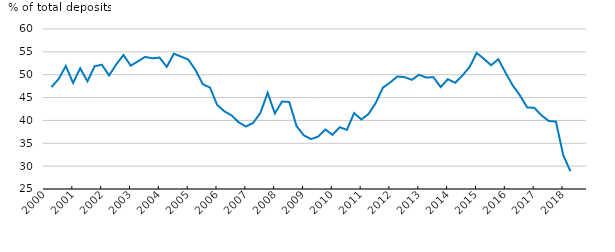
| Category | Series 2 |
|---|---|
| 2000-06-30 | 47.279 |
| 2000-09-30 | 49.07 |
| 2000-12-31 | 51.906 |
| 2001-03-31 | 48.212 |
| 2001-06-30 | 51.4 |
| 2001-09-30 | 48.548 |
| 2001-12-31 | 51.85 |
| 2002-03-31 | 52.194 |
| 2002-06-30 | 49.845 |
| 2002-09-30 | 52.27 |
| 2002-12-31 | 54.323 |
| 2003-03-31 | 51.984 |
| 2003-06-30 | 52.918 |
| 2003-09-30 | 53.906 |
| 2003-12-31 | 53.587 |
| 2004-03-31 | 53.753 |
| 2004-06-30 | 51.722 |
| 2004-09-30 | 54.598 |
| 2004-12-31 | 53.954 |
| 2005-03-31 | 53.308 |
| 2005-06-30 | 50.991 |
| 2005-09-30 | 47.93 |
| 2005-12-31 | 47.177 |
| 2006-03-31 | 43.386 |
| 2006-06-30 | 41.994 |
| 2006-09-30 | 41.096 |
| 2006-12-31 | 39.57 |
| 2007-03-31 | 38.663 |
| 2007-06-30 | 39.469 |
| 2007-09-30 | 41.675 |
| 2007-12-31 | 46.034 |
| 2008-03-31 | 41.533 |
| 2008-06-30 | 44.145 |
| 2008-09-30 | 44.038 |
| 2008-12-31 | 38.807 |
| 2009-03-31 | 36.755 |
| 2009-06-30 | 35.916 |
| 2009-09-30 | 36.444 |
| 2009-12-31 | 38.014 |
| 2010-03-31 | 36.844 |
| 2010-06-30 | 38.52 |
| 2010-09-30 | 37.941 |
| 2010-12-31 | 41.612 |
| 2011-03-31 | 40.203 |
| 2011-06-30 | 41.418 |
| 2011-09-30 | 43.848 |
| 2011-12-31 | 47.181 |
| 2012-03-31 | 48.314 |
| 2012-06-30 | 49.617 |
| 2012-09-30 | 49.46 |
| 2012-12-31 | 48.884 |
| 2013-03-31 | 50.01 |
| 2013-06-30 | 49.38 |
| 2013-09-30 | 49.46 |
| 2013-12-31 | 47.294 |
| 2014-03-31 | 49.023 |
| 2014-06-30 | 48.233 |
| 2014-09-30 | 49.779 |
| 2014-12-31 | 51.657 |
| 2015-03-31 | 54.759 |
| 2015-06-30 | 53.486 |
| 2015-09-30 | 52.07 |
| 2015-12-31 | 53.395 |
| 2016-03-31 | 50.438 |
| 2016-06-30 | 47.659 |
| 2016-09-30 | 45.48 |
| 2016-12-31 | 42.849 |
| 2017-03-31 | 42.747 |
| 2017-06-30 | 41.096 |
| 2017-09-30 | 39.878 |
| 2017-12-31 | 39.744 |
| 2018-03-31 | 32.457 |
| 2018-06-30 | 28.879 |